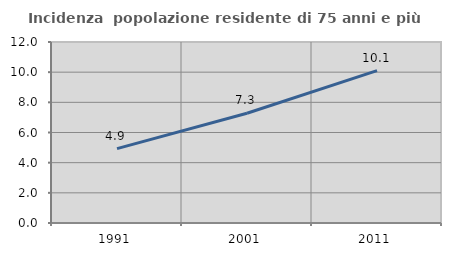
| Category | Incidenza  popolazione residente di 75 anni e più |
|---|---|
| 1991.0 | 4.934 |
| 2001.0 | 7.276 |
| 2011.0 | 10.103 |